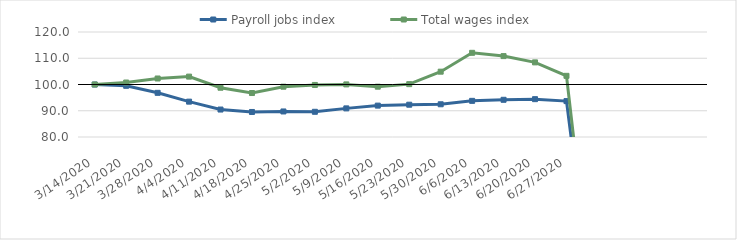
| Category | Payroll jobs index | Total wages index |
|---|---|---|
| 14/03/2020 | 100 | 100 |
| 21/03/2020 | 99.498 | 100.75 |
| 28/03/2020 | 96.827 | 102.289 |
| 04/04/2020 | 93.468 | 103.002 |
| 11/04/2020 | 90.462 | 98.77 |
| 18/04/2020 | 89.53 | 96.756 |
| 25/04/2020 | 89.73 | 99.164 |
| 02/05/2020 | 89.602 | 99.829 |
| 09/05/2020 | 90.904 | 100.038 |
| 16/05/2020 | 91.956 | 99.163 |
| 23/05/2020 | 92.299 | 100.136 |
| 30/05/2020 | 92.465 | 104.883 |
| 06/06/2020 | 93.774 | 112.067 |
| 13/06/2020 | 94.177 | 110.816 |
| 20/06/2020 | 94.415 | 108.424 |
| 27/06/2020 | 93.678 | 103.299 |